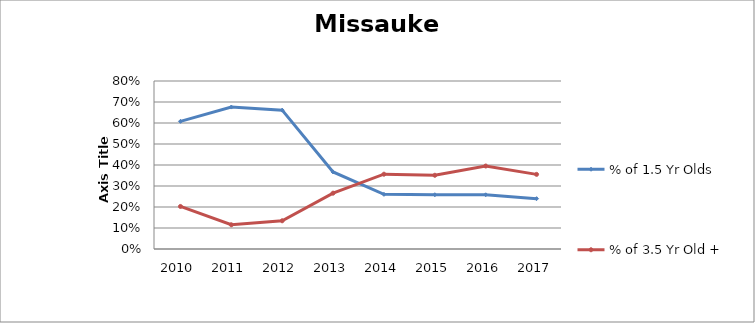
| Category | % of 1.5 Yr Olds | % of 3.5 Yr Old + |
|---|---|---|
| 2010.0 | 0.608 | 0.203 |
| 2011.0 | 0.676 | 0.115 |
| 2012.0 | 0.661 | 0.134 |
| 2013.0 | 0.367 | 0.266 |
| 2014.0 | 0.26 | 0.356 |
| 2015.0 | 0.258 | 0.351 |
| 2016.0 | 0.258 | 0.395 |
| 2017.0 | 0.24 | 0.355 |